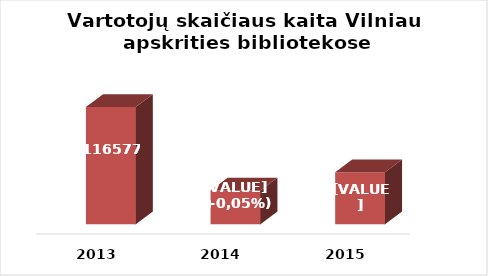
| Category | Series 0 |
|---|---|
| 2013.0 | 116577 |
| 2014.0 | 110470 |
| 2015.0 | 111801 |